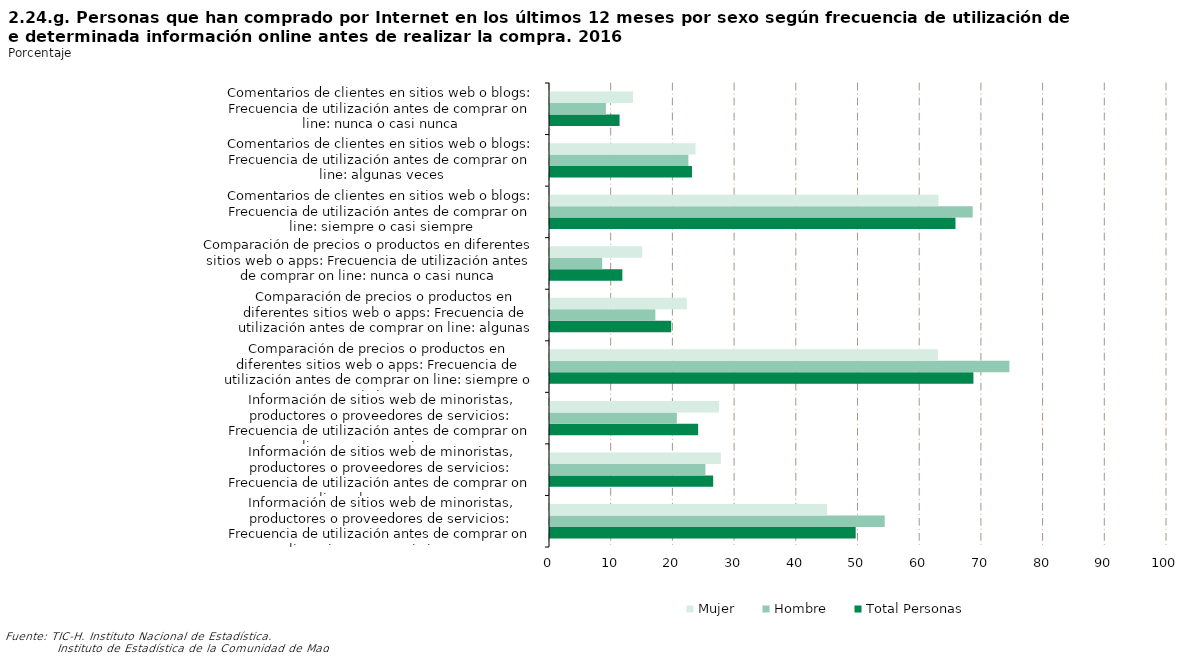
| Category | Total Personas | Hombre | Mujer |
|---|---|---|---|
| Información de sitios web de minoristas, productores o proveedores de servicios: Frecuencia de utilización antes de comprar on line: siempre o casi siempre | 49.544 | 54.252 | 44.892 |
| Información de sitios web de minoristas, productores o proveedores de servicios: Frecuencia de utilización antes de comprar on line: algunas veces | 26.449 | 25.189 | 27.694 |
| Información de sitios web de minoristas, productores o proveedores de servicios: Frecuencia de utilización antes de comprar on line: nunca o casi nunca | 24.007 | 20.559 | 27.414 |
| Comparación de precios o productos en diferentes sitios web o apps: Frecuencia de utilización antes de comprar on line: siempre o casi siempre | 68.627 | 74.462 | 62.863 |
| Comparación de precios o productos en diferentes sitios web o apps: Frecuencia de utilización antes de comprar on line: algunas veces | 19.647 | 17.079 | 22.184 |
| Comparación de precios o productos en diferentes sitios web o apps: Frecuencia de utilización antes de comprar on line: nunca o casi nunca | 11.726 | 8.459 | 14.953 |
| Comentarios de clientes en sitios web o blogs: Frecuencia de utilización antes de comprar on line: siempre o casi siempre | 65.717 | 68.512 | 62.955 |
| Comentarios de clientes en sitios web o blogs: Frecuencia de utilización antes de comprar on line: algunas veces | 23.009 | 22.426 | 23.586 |
| Comentarios de clientes en sitios web o blogs: Frecuencia de utilización antes de comprar on line: nunca o casi nunca | 11.274 | 9.062 | 13.46 |